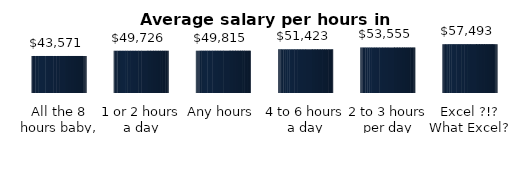
| Category | Average salary per hours in excel |
|---|---|
| All the 8 hours baby, all the 8! | 43571.163 |
| 1 or 2 hours a day | 49726.376 |
| Any hours | 49814.598 |
| 4 to 6 hours a day | 51423.251 |
| 2 to 3 hours per day | 53554.662 |
| Excel ?!? What Excel? | 57493.382 |